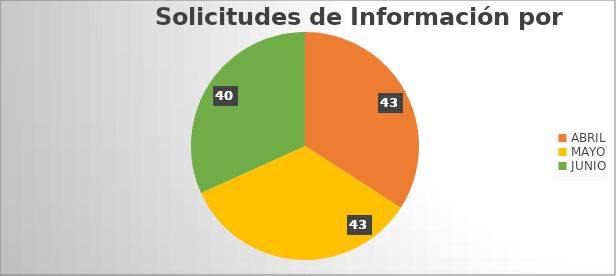
| Category | Series 0 |
|---|---|
| ABRIL | 43 |
| MAYO | 43 |
| JUNIO | 40 |